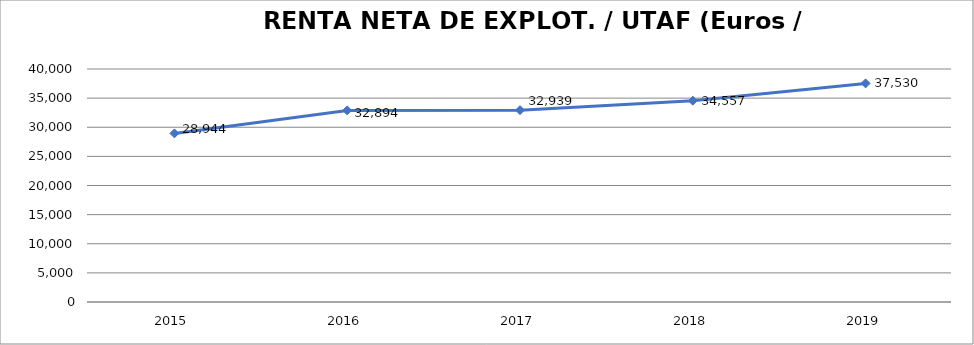
| Category | 2015 |
|---|---|
| 2015.0 | 28944.479 |
| 2016.0 | 32894.478 |
| 2017.0 | 32938.776 |
| 2018.0 | 34556.936 |
| 2019.0 | 37529.685 |